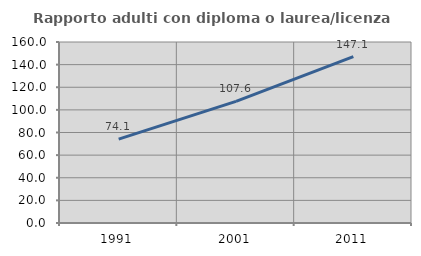
| Category | Rapporto adulti con diploma o laurea/licenza media  |
|---|---|
| 1991.0 | 74.142 |
| 2001.0 | 107.576 |
| 2011.0 | 147.077 |